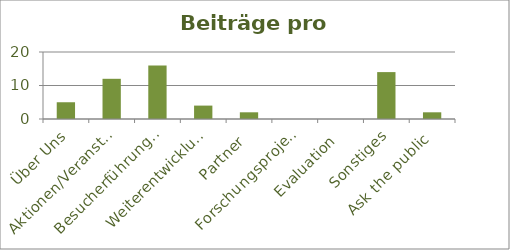
| Category | Beiträge |
|---|---|
| Über Uns | 5 |
| Aktionen/Veranstaltungen | 12 |
| Besucherführungen  | 16 |
| Weiterentwicklung  | 4 |
| Partner | 2 |
| Forschungsprojekte | 0 |
| Evaluation | 0 |
| Sonstiges | 14 |
| Ask the public | 2 |